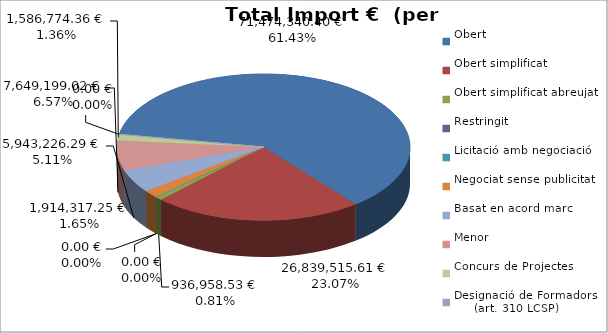
| Category | Total preu
(amb IVA) |
|---|---|
| Obert | 71474340.4 |
| Obert simplificat | 26839515.61 |
| Obert simplificat abreujat | 936958.53 |
| Restringit | 0 |
| Licitació amb negociació | 0 |
| Negociat sense publicitat | 1914317.25 |
| Basat en acord marc | 5943226.29 |
| Menor | 7649199.02 |
| Concurs de Projectes | 1586774.36 |
| Designació de Formadors
     (art. 310 LCSP) | 0 |